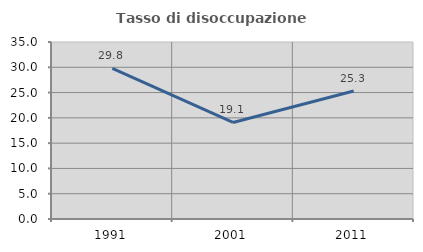
| Category | Tasso di disoccupazione giovanile  |
|---|---|
| 1991.0 | 29.808 |
| 2001.0 | 19.091 |
| 2011.0 | 25.301 |